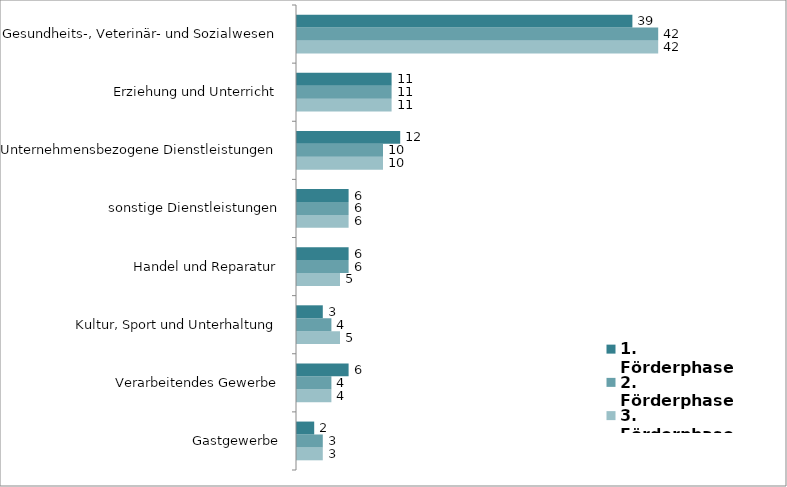
| Category | 1. Förderphase | 2. Förderphase | 3. Förderphase |
|---|---|---|---|
| Gesundheits-, Veterinär- und Sozialwesen | 39 | 42 | 42 |
| Erziehung und Unterricht | 11 | 11 | 11 |
| Unternehmensbezogene Dienstleistungen | 12 | 10 | 10 |
| sonstige Dienstleistungen | 6 | 6 | 6 |
| Handel und Reparatur | 6 | 6 | 5 |
| Kultur, Sport und Unterhaltung | 3 | 4 | 5 |
| Verarbeitendes Gewerbe | 6 | 4 | 4 |
| Gastgewerbe | 2 | 3 | 3 |